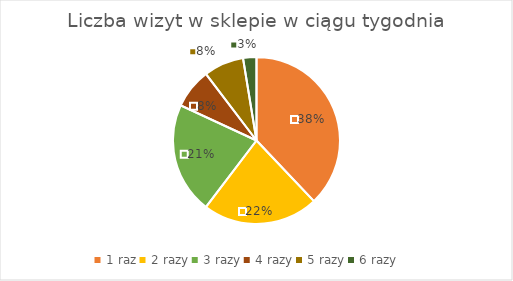
| Category | Series 0 |
|---|---|
| 1 raz | 44 |
| 2 razy | 26 |
| 3 razy | 25 |
| 4 razy | 9 |
| 5 razy | 9 |
| 6 razy | 3 |